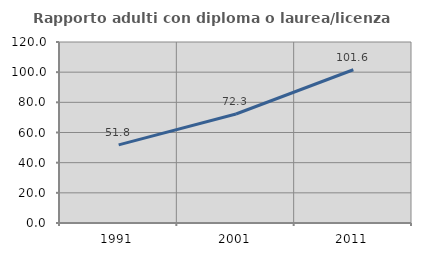
| Category | Rapporto adulti con diploma o laurea/licenza media  |
|---|---|
| 1991.0 | 51.81 |
| 2001.0 | 72.274 |
| 2011.0 | 101.59 |